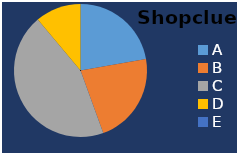
| Category | Shopclues |
|---|---|
| A | 50 |
| B | 50 |
| C | 100 |
| D | 25 |
| E | 0 |